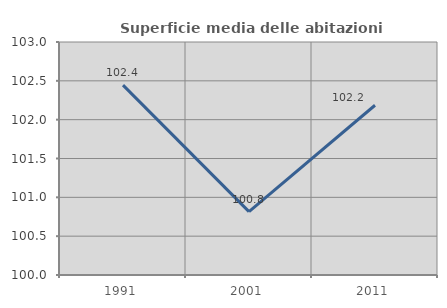
| Category | Superficie media delle abitazioni occupate |
|---|---|
| 1991.0 | 102.444 |
| 2001.0 | 100.815 |
| 2011.0 | 102.186 |